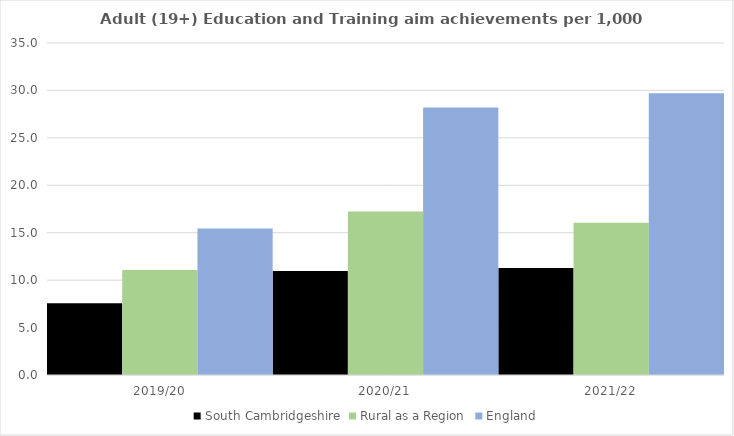
| Category | South Cambridgeshire | Rural as a Region | England |
|---|---|---|---|
| 2019/20 | 7.573 | 11.081 | 15.446 |
| 2020/21 | 10.977 | 17.224 | 28.211 |
| 2021/22 | 11.289 | 16.063 | 29.711 |